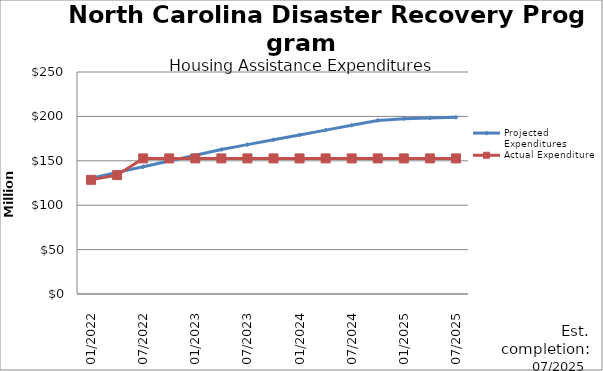
| Category | Projected Expenditures | Actual Expenditure |
|---|---|---|
| 01/2022 | 130475751.785 | 128602880.84 |
| 4/2022 | 136929820.785 | 133973327 |
| 07/2022 | 143383889.785 | 152701075.5 |
| 10/2022 | 149837958.785 | 152701075.5 |
| 01/2023 | 156292027.785 | 152701075.5 |
| 4/2023 | 162746096.785 | 152701075.5 |
| 07/2023 | 168200167.785 | 152701075.5 |
| 10/2023 | 173654238.785 | 152701075.5 |
| 01/2024 | 179108309.785 | 152701075.5 |
| 4/2024 | 184562380.785 | 152701075.5 |
| 07/2024 | 190016451.785 | 152701075.5 |
| 10/2024 | 195470522.785 | 152701075.5 |
| 01/2025 | 197470522.785 | 152701075.5 |
| 4/2025 | 198265440.785 | 152701075.5 |
| 07/2025 | 199022549.785 | 152701075.5 |